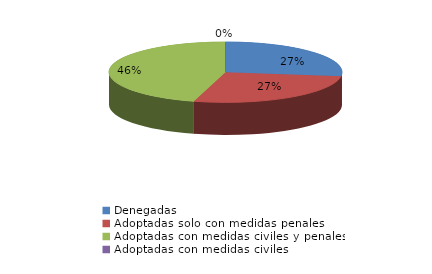
| Category | Series 0 |
|---|---|
| Denegadas | 196 |
| Adoptadas solo con medidas penales | 196 |
| Adoptadas con medidas civiles y penales | 329 |
| Adoptadas con medidas civiles | 0 |